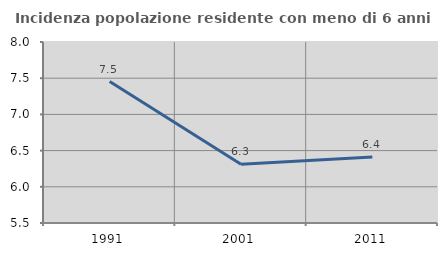
| Category | Incidenza popolazione residente con meno di 6 anni |
|---|---|
| 1991.0 | 7.454 |
| 2001.0 | 6.313 |
| 2011.0 | 6.412 |